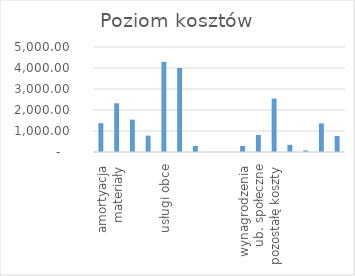
| Category | Series 0 |
|---|---|
| amortyacja | 1371.6 |
| materiały | 2320 |
|  | 1540 |
|  | 780 |
| usługi obce | 4290 |
|  | 4000 |
|  | 290 |
|  | 0 |
|  | 0 |
| wynagrodzenia | 290 |
| ub. społeczne | 812 |
| pozostałę koszty | 2541.5 |